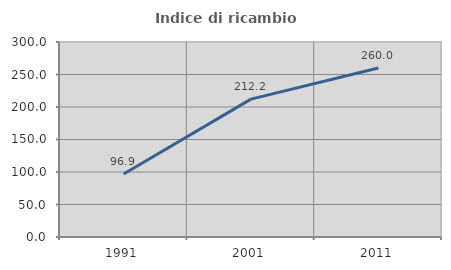
| Category | Indice di ricambio occupazionale  |
|---|---|
| 1991.0 | 96.85 |
| 2001.0 | 212.162 |
| 2011.0 | 260 |